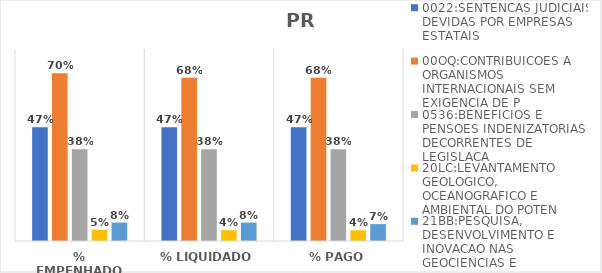
| Category | 0022:SENTENCAS JUDICIAIS DEVIDAS POR EMPRESAS ESTATAIS | 00OQ:CONTRIBUICOES A ORGANISMOS INTERNACIONAIS SEM EXIGENCIA DE P | 0536:BENEFICIOS E PENSOES INDENIZATORIAS DECORRENTES DE LEGISLACA | 20LC:LEVANTAMENTO GEOLOGICO, OCEANOGRAFICO E AMBIENTAL DO POTEN | 21BB:PESQUISA, DESENVOLVIMENTO E INOVACAO NAS GEOCIENCIAS E |
|---|---|---|---|---|---|
| % EMPENHADO | 0.474 | 0.699 | 0.383 | 0.047 | 0.077 |
| % LIQUIDADO | 0.474 | 0.681 | 0.383 | 0.045 | 0.077 |
| % PAGO | 0.474 | 0.681 | 0.383 | 0.045 | 0.07 |